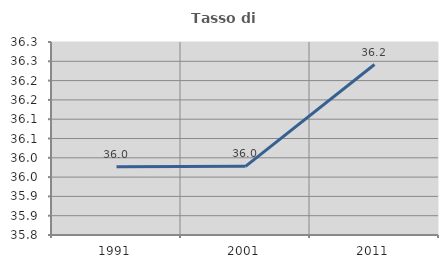
| Category | Tasso di occupazione   |
|---|---|
| 1991.0 | 35.977 |
| 2001.0 | 35.978 |
| 2011.0 | 36.242 |